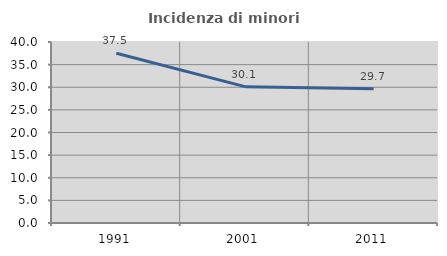
| Category | Incidenza di minori stranieri |
|---|---|
| 1991.0 | 37.5 |
| 2001.0 | 30.137 |
| 2011.0 | 29.688 |